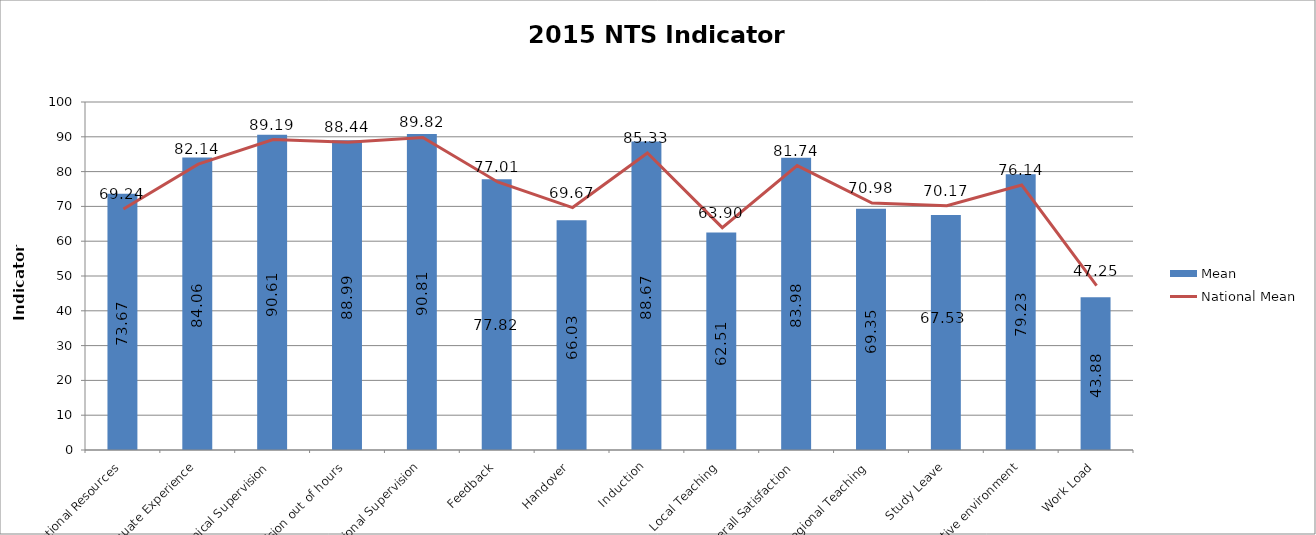
| Category | Mean |
|---|---|
| Access to Educational Resources | 73.67 |
| Adequate Experience | 84.06 |
| Clinical Supervision | 90.61 |
| Clinical Supervision out of hours | 88.99 |
| Educational Supervision | 90.81 |
| Feedback | 77.82 |
| Handover | 66.03 |
| Induction | 88.67 |
| Local Teaching | 62.51 |
| Overall Satisfaction | 83.98 |
| Regional Teaching | 69.35 |
| Study Leave | 67.53 |
| Supportive environment | 79.23 |
| Work Load | 43.88 |